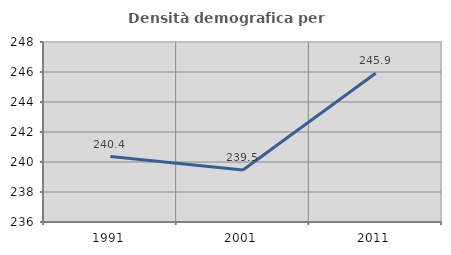
| Category | Densità demografica |
|---|---|
| 1991.0 | 240.362 |
| 2001.0 | 239.472 |
| 2011.0 | 245.917 |